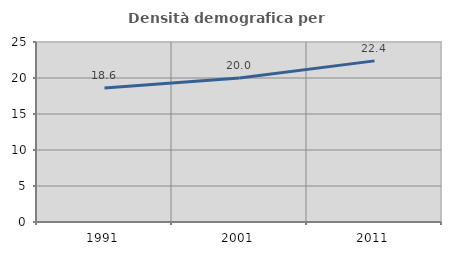
| Category | Densità demografica |
|---|---|
| 1991.0 | 18.622 |
| 2001.0 | 19.985 |
| 2011.0 | 22.377 |